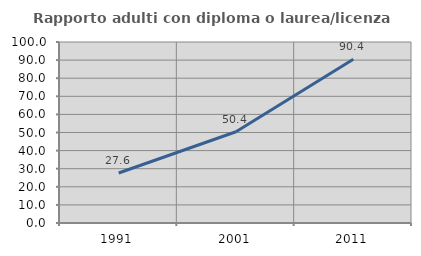
| Category | Rapporto adulti con diploma o laurea/licenza media  |
|---|---|
| 1991.0 | 27.632 |
| 2001.0 | 50.394 |
| 2011.0 | 90.437 |